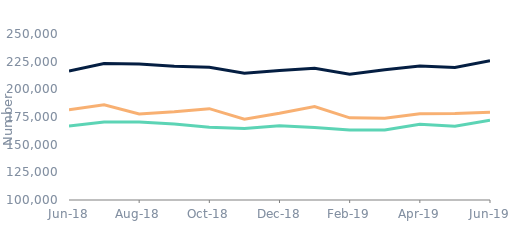
| Category | First-time
buyers | Homemovers | Remortgagors |
|---|---|---|---|
| 2018-06-01 | 166910.567 | 216494.579 | 181611.382 |
| 2018-07-01 | 170547.318 | 223301.079 | 186047.294 |
| 2018-08-01 | 170424.372 | 222910.125 | 177772.199 |
| 2018-09-01 | 168614.565 | 220923.548 | 179653.653 |
| 2018-10-01 | 165843.362 | 219879.433 | 182518.205 |
| 2018-11-01 | 164593.918 | 214478.456 | 173081.465 |
| 2018-12-01 | 167129.793 | 216927.298 | 178399.368 |
| 2019-01-01 | 165423.234 | 219056.633 | 184500.453 |
| 2019-02-01 | 163271.592 | 213650.166 | 174225.894 |
| 2019-03-01 | 163201.401 | 217792.991 | 173924.821 |
| 2019-04-01 | 168459.489 | 221042.667 | 177881.95 |
| 2019-05-01 | 166682.229 | 219802.589 | 178255.289 |
| 2019-06-01 | 172157.56 | 225756.276 | 179399.819 |